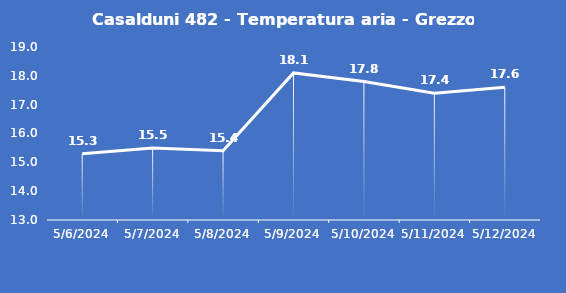
| Category | Casalduni 482 - Temperatura aria - Grezzo (°C) |
|---|---|
| 5/6/24 | 15.3 |
| 5/7/24 | 15.5 |
| 5/8/24 | 15.4 |
| 5/9/24 | 18.1 |
| 5/10/24 | 17.8 |
| 5/11/24 | 17.4 |
| 5/12/24 | 17.6 |